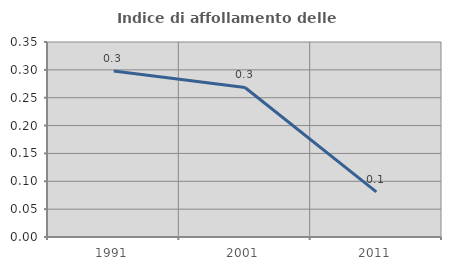
| Category | Indice di affollamento delle abitazioni  |
|---|---|
| 1991.0 | 0.298 |
| 2001.0 | 0.268 |
| 2011.0 | 0.081 |